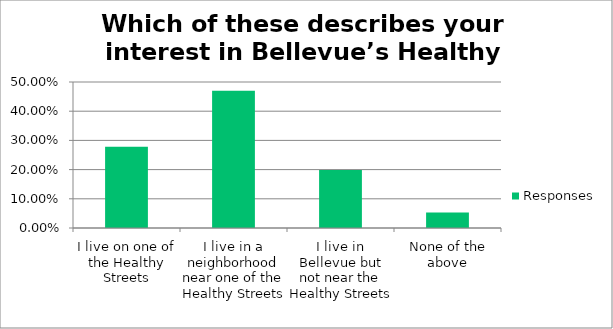
| Category | Responses |
|---|---|
| I live on one of the Healthy Streets | 0.278 |
| I live in a neighborhood near one of the Healthy Streets | 0.47 |
| I live in Bellevue but not near the Healthy Streets | 0.199 |
| None of the above | 0.053 |